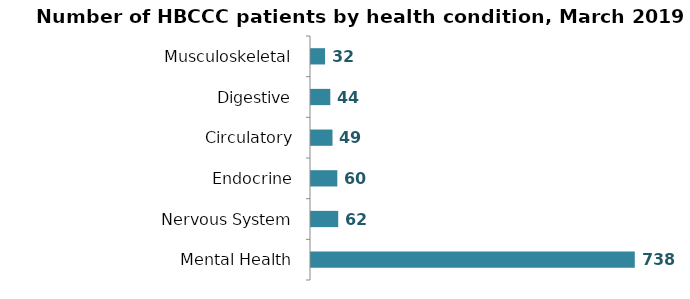
| Category | Series 0 |
|---|---|
| Mental Health | 738 |
| Nervous System | 62 |
| Endocrine | 60 |
| Circulatory | 49 |
| Digestive | 44 |
| Musculoskeletal | 32 |